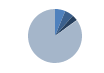
| Category | Series 0 |
|---|---|
| ARRASTRE | 29 |
| CERCO | 25 |
| PALANGRE | 16 |
| REDES DE ENMALLE | 1 |
| ARTES MENORES | 397 |
| SIN TIPO ASIGNADO | 0 |